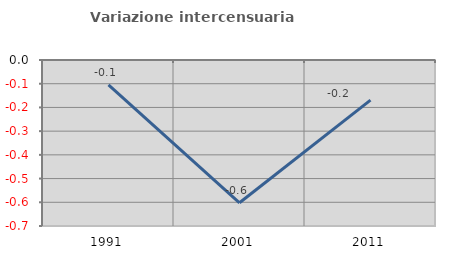
| Category | Variazione intercensuaria annua |
|---|---|
| 1991.0 | -0.105 |
| 2001.0 | -0.602 |
| 2011.0 | -0.169 |